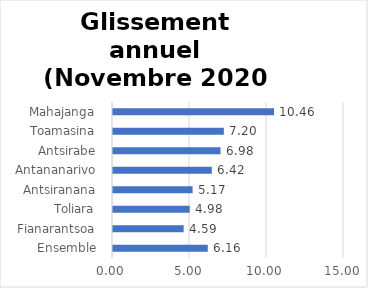
| Category | Glissement annuel |
|---|---|
|  Ensemble  | 6.155 |
|  Fianarantsoa  | 4.589 |
|  Toliara  | 4.98 |
|  Antsiranana  | 5.169 |
|  Antananarivo  | 6.417 |
|  Antsirabe  | 6.981 |
|  Toamasina  | 7.198 |
|  Mahajanga  | 10.456 |